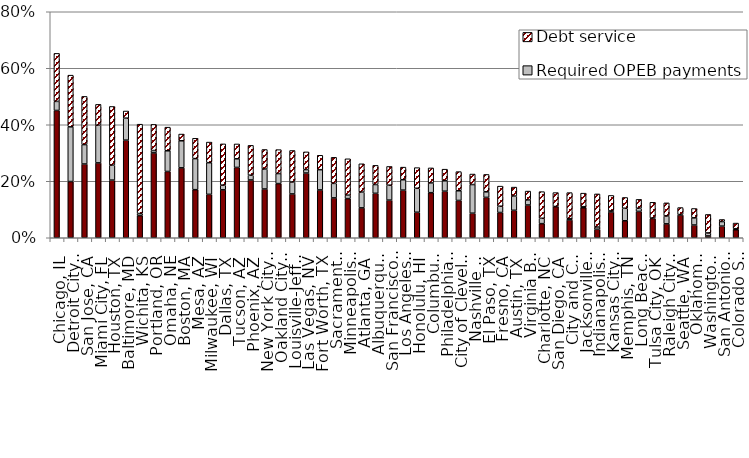
| Category | Required pension payments | Required OPEB payments | Debt service |
|---|---|---|---|
| Chicago, IL | 0.451 | 0.032 | 0.17 |
| Detroit City, MI | 0.199 | 0.194 | 0.183 |
| San Jose, CA | 0.261 | 0.069 | 0.171 |
| Miami City, FL | 0.265 | 0.133 | 0.074 |
| Houston, TX | 0.204 | 0.053 | 0.208 |
| Baltimore, MD | 0.346 | 0.078 | 0.025 |
| Wichita, KS | 0.078 | 0.007 | 0.316 |
| Portland, OR | 0.3 | 0.008 | 0.092 |
| Omaha, NE | 0.235 | 0.073 | 0.084 |
| Boston, MA | 0.247 | 0.096 | 0.024 |
| Mesa, AZ | 0.17 | 0.11 | 0.072 |
| Milwaukee, WI | 0.154 | 0.112 | 0.073 |
| Dallas, TX | 0.17 | 0.017 | 0.146 |
| Tucson, AZ | 0.249 | 0.031 | 0.053 |
| Phoenix, AZ | 0.205 | 0.017 | 0.106 |
| New York City, NY | 0.173 | 0.071 | 0.069 |
| Oakland City, CA | 0.192 | 0.035 | 0.085 |
| Louisville-Jefferson County, KY | 0.155 | 0.042 | 0.111 |
| Las Vegas, NV | 0.229 | 0.012 | 0.063 |
| Fort Worth, TX | 0.169 | 0.072 | 0.051 |
| Sacramento City, CA | 0.141 | 0.051 | 0.092 |
| Minneapolis, MN | 0.139 | 0.012 | 0.129 |
| Atlanta, GA | 0.106 | 0.056 | 0.1 |
| Albuquerque City, NM | 0.157 | 0.031 | 0.068 |
| San Francisco, CA | 0.133 | 0.053 | 0.066 |
| Los Angeles, CA | 0.169 | 0.037 | 0.045 |
| Honolulu, HI | 0.09 | 0.085 | 0.073 |
| Columbus City, OH | 0.16 | 0.034 | 0.053 |
| Philadelphia, PA | 0.165 | 0.037 | 0.041 |
| City of Cleveland, OH | 0.132 | 0.034 | 0.068 |
| Nashville & Davidson County, TN | 0.087 | 0.101 | 0.037 |
| El Paso, TX | 0.143 | 0.02 | 0.062 |
| Fresno, CA | 0.089 | 0.022 | 0.071 |
| Austin, TX | 0.097 | 0.05 | 0.032 |
| Virginia Beach, VA | 0.116 | 0.018 | 0.032 |
| Charlotte, NC | 0.05 | 0.019 | 0.094 |
| San Diego, CA | 0.111 | 0 | 0.049 |
| City and County of Denver, CO | 0.063 | 0.004 | 0.092 |
| Jacksonville, FL | 0.106 | 0.004 | 0.048 |
| Indianapolis, IN | 0.03 | 0.008 | 0.117 |
| Kansas City, MO | 0.091 | 0.004 | 0.055 |
| Memphis, TN | 0.06 | 0.044 | 0.038 |
| Long Beach City, CA | 0.093 | 0.011 | 0.031 |
| Tulsa City, OK | 0.068 | 0.002 | 0.056 |
| Raleigh City, NC | 0.049 | 0.028 | 0.046 |
| Seattle, WA | 0.081 | 0.002 | 0.025 |
| Oklahoma City, OK | 0.045 | 0.025 | 0.033 |
| Washington DC, DC | 0.006 | 0.011 | 0.065 |
| San Antonio, TX | 0.041 | 0.016 | 0.007 |
| Colorado Springs, CO | 0.028 | 0.004 | 0.02 |